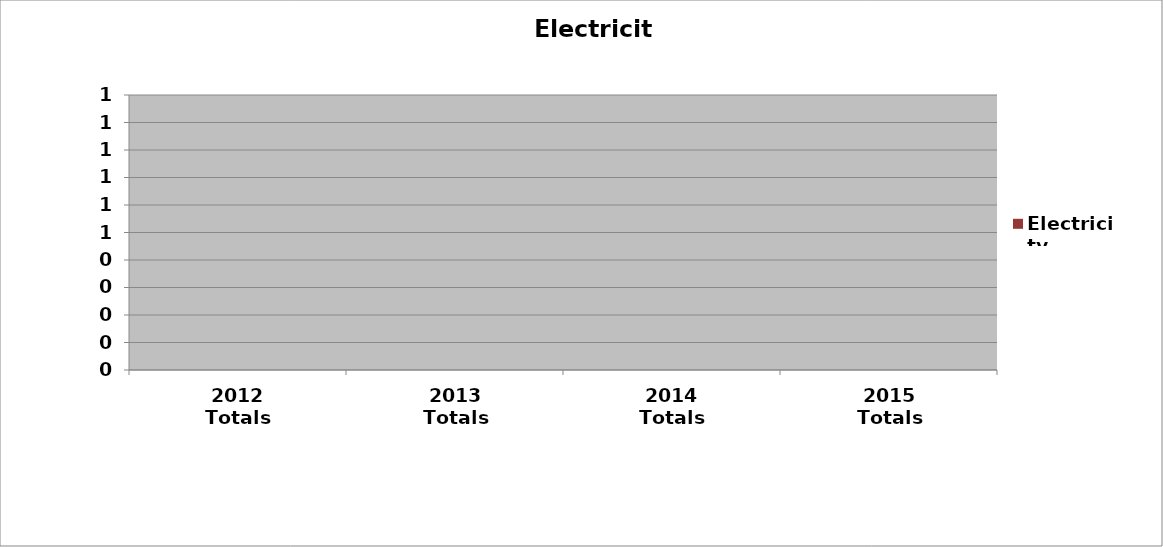
| Category | Electricity |
|---|---|
| 2012 Totals | 0 |
| 2013 Totals | 0 |
| 2014 Totals | 0 |
| 2015 Totals | 0 |